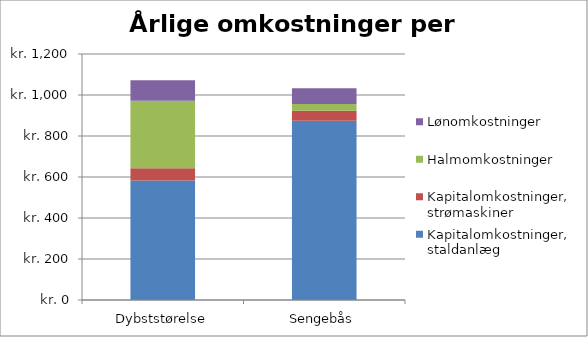
| Category | Kapitalomkostninger, staldanlæg | Kapitalomkostninger, strømaskiner  | Halmomkostninger  | Lønomkostninger |
|---|---|---|---|---|
| Dybststørelse | 582.993 | 60.214 | 328.5 | 100.831 |
| Sengebås | 874.49 | 48.171 | 32.85 | 77.562 |